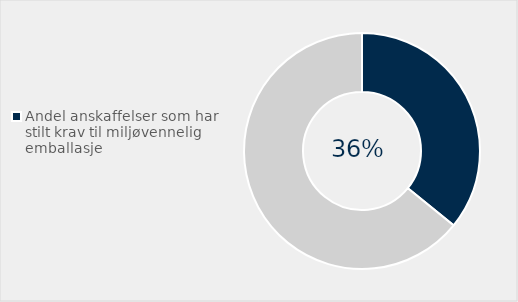
| Category | Series 0 |
|---|---|
| Andel anskaffelser som har stilt krav til miljøvennelig emballasje | 0.358 |
| Ikke stilt krav | 0.642 |